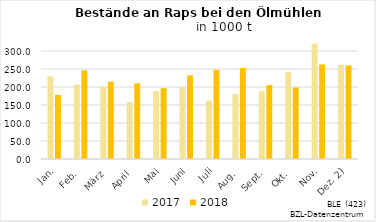
| Category | 2017 | 2018 |
|---|---|---|
| Jan. | 229.588 | 178.034 |
| Feb. | 206.692 | 246.227 |
| März | 200.539 | 214.861 |
| April | 157.986 | 210.149 |
| Mai | 188.865 | 196.665 |
| Juni | 199.531 | 232.29 |
| Juli | 162.204 | 247.627 |
| Aug. | 180.458 | 252.758 |
| Sept. | 188.313 | 205.586 |
| Okt. | 242.155 | 198.378 |
| Nov. | 320.563 | 262.639 |
| Dez. 2) | 261.737 | 259.808 |